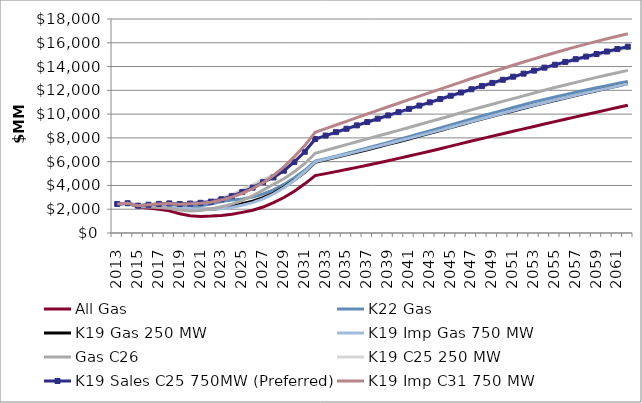
| Category | All Gas | K22 Gas | K19 Gas 250 MW | K19 Imp Gas 750 MW | Gas C26 | K19 C25 250 MW | K19 Sales C25 750MW (Preferred) | K19 Imp C31 750 MW |
|---|---|---|---|---|---|---|---|---|
| 2013.0 | 2443 | 2442 | 2442 | 2442 | 2443 | 2442 | 2442 | 2442 |
| 2014.0 | 2508 | 2505 | 2505 | 2505 | 2507 | 2506 | 2505 | 2505 |
| 2015.0 | 2186 | 2289 | 2264 | 2265 | 2216 | 2303 | 2299 | 2298 |
| 2016.0 | 2101 | 2345 | 2284 | 2288 | 2185 | 2386 | 2378 | 2374 |
| 2017.0 | 1995 | 2387 | 2284 | 2291 | 2145 | 2461 | 2450 | 2440 |
| 2018.0 | 1860 | 2383 | 2246 | 2259 | 2088 | 2504 | 2490 | 2479 |
| 2019.0 | 1620 | 2271 | 2098 | 2123 | 1928 | 2449 | 2437 | 2423 |
| 2020.0 | 1449 | 2230 | 2019 | 2066 | 1847 | 2479 | 2475 | 2456 |
| 2021.0 | 1396 | 2295 | 1992 | 2005 | 1899 | 2585 | 2538 | 2499 |
| 2022.0 | 1420 | 2439 | 1993 | 1972 | 2034 | 2721 | 2638 | 2580 |
| 2023.0 | 1474 | 2642 | 2079 | 2034 | 2207 | 2945 | 2837 | 2771 |
| 2024.0 | 1570 | 2766 | 2241 | 2144 | 2431 | 3242 | 3097 | 3013 |
| 2025.0 | 1737 | 2865 | 2463 | 2328 | 2746 | 3634 | 3443 | 3344 |
| 2026.0 | 1910 | 3022 | 2669 | 2550 | 3124 | 4048 | 3816 | 3731 |
| 2027.0 | 2186 | 3284 | 2973 | 2874 | 3606 | 4502 | 4273 | 4237 |
| 2028.0 | 2550 | 3626 | 3359 | 3281 | 4096 | 4856 | 4673 | 4839 |
| 2029.0 | 2983 | 4086 | 3862 | 3800 | 4556 | 5369 | 5241 | 5568 |
| 2030.0 | 3510 | 4652 | 4448 | 4436 | 5152 | 6050 | 5975 | 6422 |
| 2031.0 | 4136 | 5271 | 5097 | 5149 | 5842 | 6847 | 6832 | 7353 |
| 2032.0 | 4831 | 6038 | 5945 | 5988 | 6709 | 7852 | 7904 | 8470 |
| 2033.0 | 4995 | 6251 | 6154 | 6197 | 6951 | 8139 | 8194 | 8775 |
| 2034.0 | 5162 | 6469 | 6363 | 6409 | 7194 | 8424 | 8483 | 9084 |
| 2035.0 | 5337 | 6696 | 6575 | 6626 | 7434 | 8706 | 8767 | 9395 |
| 2036.0 | 5518 | 6923 | 6789 | 6843 | 7675 | 8989 | 9052 | 9705 |
| 2037.0 | 5703 | 7154 | 7008 | 7062 | 7915 | 9270 | 9335 | 10012 |
| 2038.0 | 5891 | 7387 | 7229 | 7284 | 8156 | 9548 | 9614 | 10317 |
| 2039.0 | 6083 | 7622 | 7453 | 7509 | 8396 | 9824 | 9891 | 10618 |
| 2040.0 | 6279 | 7860 | 7680 | 7736 | 8636 | 10100 | 10166 | 10917 |
| 2041.0 | 6477 | 8101 | 7911 | 7962 | 8877 | 10376 | 10441 | 11215 |
| 2042.0 | 6677 | 8345 | 8145 | 8189 | 9121 | 10650 | 10716 | 11513 |
| 2043.0 | 6883 | 8591 | 8380 | 8419 | 9366 | 10923 | 10991 | 11810 |
| 2044.0 | 7093 | 8840 | 8619 | 8655 | 9614 | 11197 | 11267 | 12106 |
| 2045.0 | 7306 | 9091 | 8861 | 8894 | 9862 | 11470 | 11542 | 12402 |
| 2046.0 | 7519 | 9343 | 9103 | 9136 | 10111 | 11743 | 11817 | 12697 |
| 2047.0 | 7732 | 9594 | 9344 | 9376 | 10358 | 12018 | 12092 | 12992 |
| 2048.0 | 7940 | 9838 | 9579 | 9609 | 10597 | 12285 | 12361 | 13278 |
| 2049.0 | 8147 | 10079 | 9811 | 9841 | 10835 | 12549 | 12626 | 13559 |
| 2050.0 | 8350 | 10316 | 10039 | 10069 | 11070 | 12809 | 12887 | 13837 |
| 2051.0 | 8554 | 10553 | 10267 | 10297 | 11305 | 13067 | 13147 | 14110 |
| 2052.0 | 8758 | 10787 | 10490 | 10521 | 11538 | 13321 | 13404 | 14380 |
| 2053.0 | 8962 | 11013 | 10711 | 10743 | 11772 | 13572 | 13659 | 14646 |
| 2054.0 | 9167 | 11228 | 10930 | 10962 | 12004 | 13820 | 13909 | 14908 |
| 2055.0 | 9371 | 11435 | 11147 | 11174 | 12232 | 14063 | 14154 | 15164 |
| 2056.0 | 9571 | 11638 | 11358 | 11382 | 12454 | 14294 | 14389 | 15412 |
| 2057.0 | 9769 | 11834 | 11567 | 11588 | 12671 | 14519 | 14620 | 15655 |
| 2058.0 | 9964 | 12024 | 11768 | 11785 | 12883 | 14736 | 14840 | 15889 |
| 2059.0 | 10158 | 12211 | 11967 | 11977 | 13089 | 14951 | 15055 | 16116 |
| 2060.0 | 10354 | 12394 | 12164 | 12167 | 13290 | 15161 | 15266 | 16338 |
| 2061.0 | 10552 | 12574 | 12363 | 12358 | 13486 | 15367 | 15471 | 16554 |
| 2062.0 | 10748 | 12752 | 12562 | 12552 | 13677 | 15566 | 15671 | 16765 |